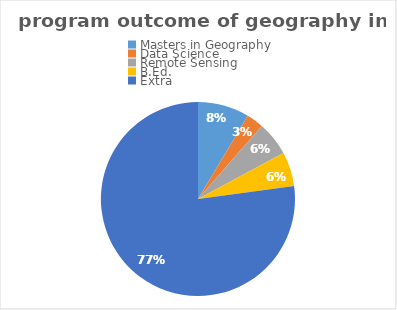
| Category | Series 0 |
|---|---|
| Masters in Geography | 3 |
| Data Science | 1 |
| Remote Sensing | 2 |
| B.Ed. | 2 |
| Extra | 27 |